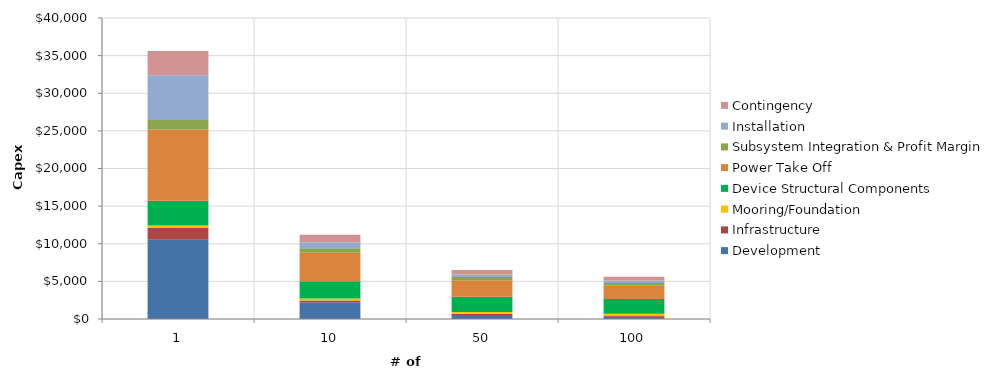
| Category | Development | Infrastructure | Mooring/Foundation | Device Structural Components | Power Take Off | Subsystem Integration & Profit Margin | Installation | Contingency |
|---|---|---|---|---|---|---|---|---|
| 1.0 | 10520 | 1650 | 240 | 3300 | 9470 | 1280 | 5920 | 3240 |
| 10.0 | 2230 | 240 | 240 | 2320 | 3770 | 610 | 780 | 1020 |
| 50.0 | 540 | 160 | 240 | 2030 | 2190 | 420 | 350 | 590 |
| 100.0 | 290 | 160 | 240 | 1970 | 1770 | 370 | 300 | 510 |